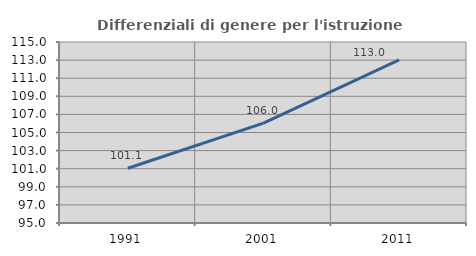
| Category | Differenziali di genere per l'istruzione superiore |
|---|---|
| 1991.0 | 101.05 |
| 2001.0 | 106.034 |
| 2011.0 | 113.035 |